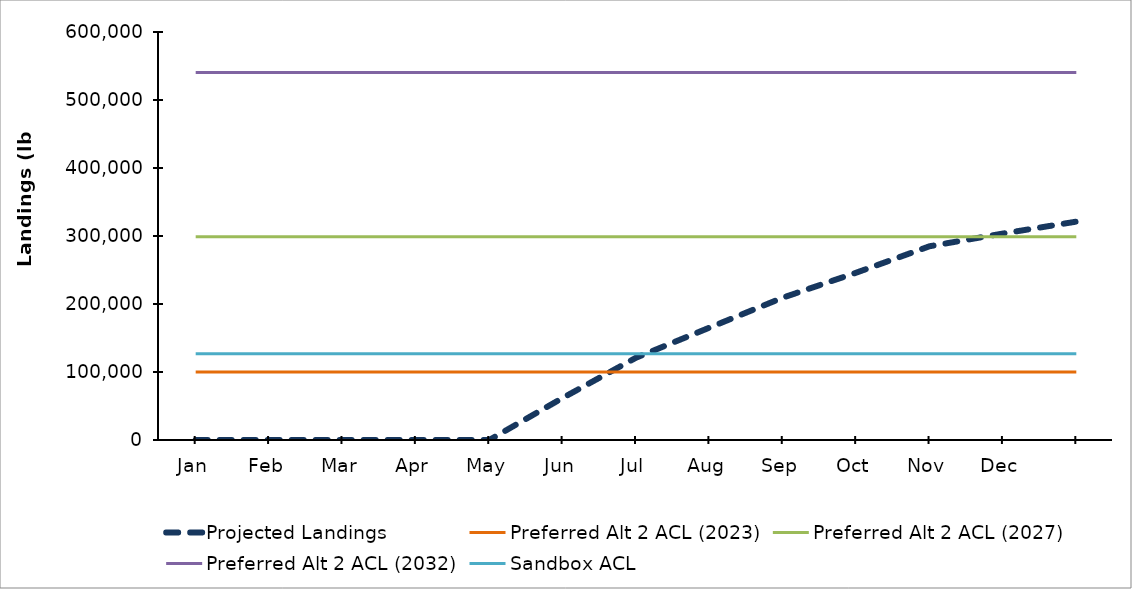
| Category | Projected Landings | Preferred Alt 2 ACL (2023) | Preferred Alt 2 ACL (2027) | Preferred Alt 2 ACL (2032) | Sandbox ACL |
|---|---|---|---|---|---|
|  Jan  | 0 | 100005 | 298721 | 540310 | 127000 |
|  Feb  | 0 | 100005 | 298721 | 540310 | 127000 |
|  Mar  | 0 | 100005 | 298721 | 540310 | 127000 |
|  Apr  | 0 | 100005 | 298721 | 540310 | 127000 |
|  May  | 0 | 100005 | 298721 | 540310 | 127000 |
|  Jun  | 61832.381 | 100005 | 298721 | 540310 | 127000 |
|  Jul  | 120978.946 | 100005 | 298721 | 540310 | 127000 |
|  Aug  | 165195.61 | 100005 | 298721 | 540310 | 127000 |
|  Sep  | 209307.545 | 100005 | 298721 | 540310 | 127000 |
|  Oct  | 246030.316 | 100005 | 298721 | 540310 | 127000 |
|  Nov  | 284909.312 | 100005 | 298721 | 540310 | 127000 |
|  Dec  | 303611.51 | 100005 | 298721 | 540310 | 127000 |